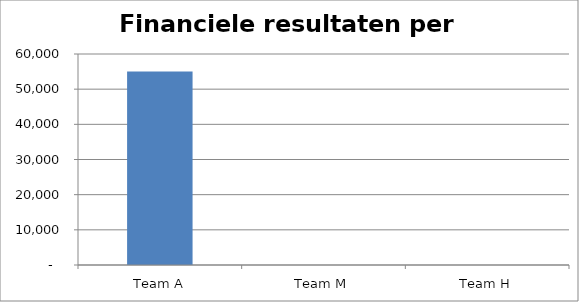
| Category | Financiele resultaten per team |
|---|---|
| Team A | 55000 |
| Team M | 0 |
| Team H | 0 |